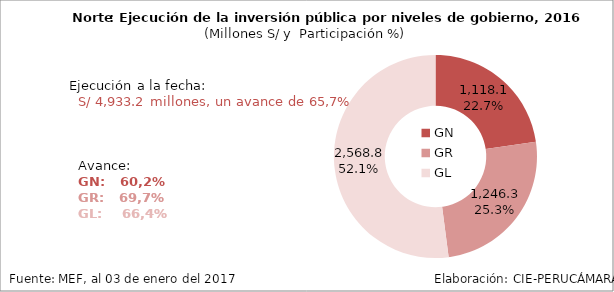
| Category | Ejecutado |
|---|---|
| GN | 1118.067 |
| GR | 1246.332 |
| GL | 2568.768 |